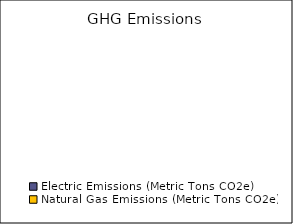
| Category | GHG Emissions |
|---|---|
| Electric Emissions (Metric Tons CO2e) | 0 |
| Natural Gas Emissions (Metric Tons CO2e) | 0 |